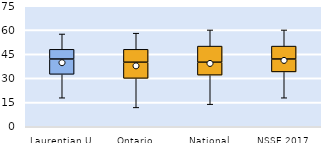
| Category | 25th | 50th | 75th |
|---|---|---|---|
| Laurentian U | 32.5 | 9.5 | 6 |
| Ontario | 30 | 10 | 8 |
| National | 32 | 8 | 10 |
| NSSE 2017 | 34 | 8 | 8 |